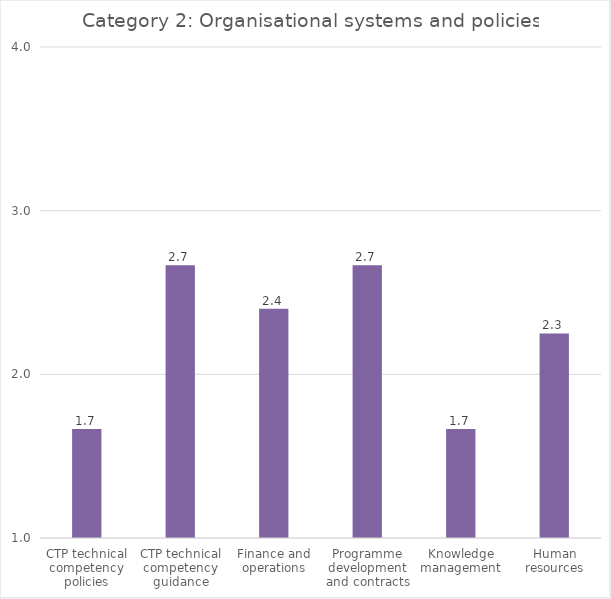
| Category |   Category 2: Organisational systems and policies |
|---|---|
| CTP technical competency policies | 1.667 |
| CTP technical competency guidance | 2.667 |
| Finance and operations | 2.4 |
| Programme development and contracts | 2.667 |
| Knowledge management | 1.667 |
| Human resources | 2.25 |